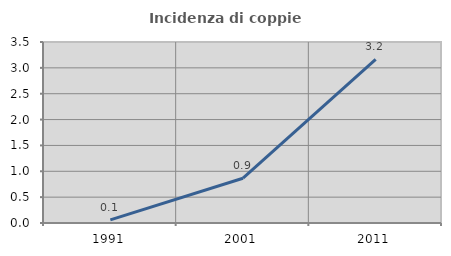
| Category | Incidenza di coppie miste |
|---|---|
| 1991.0 | 0.059 |
| 2001.0 | 0.866 |
| 2011.0 | 3.166 |